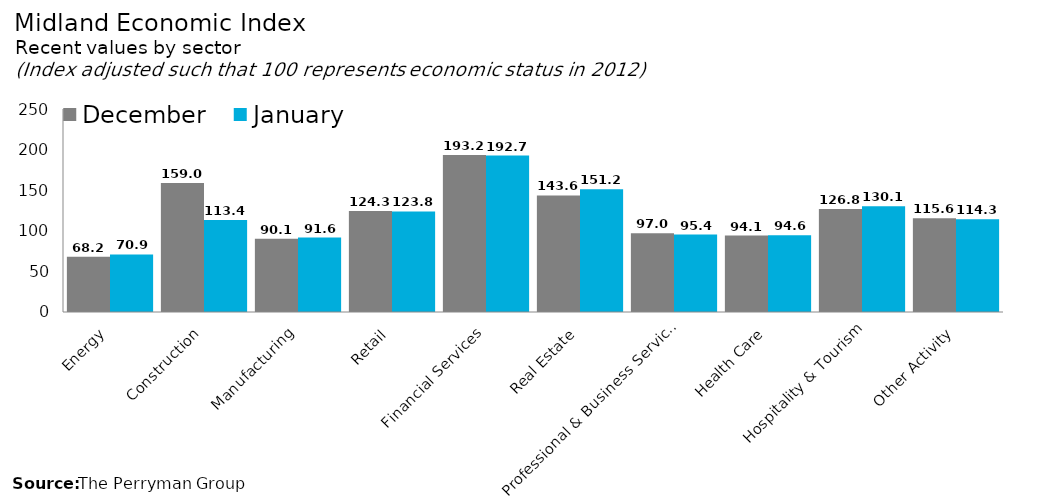
| Category | December | January |
|---|---|---|
| Energy | 68.163 | 70.893 |
| Construction | 158.992 | 113.446 |
| Manufacturing | 90.11 | 91.638 |
| Retail | 124.274 | 123.786 |
| Financial Services | 193.248 | 192.699 |
| Real Estate | 143.618 | 151.236 |
| Professional & Business Services | 96.97 | 95.423 |
| Health Care | 94.148 | 94.604 |
| Hospitality & Tourism | 126.754 | 130.112 |
| Other Activity | 115.605 | 114.347 |